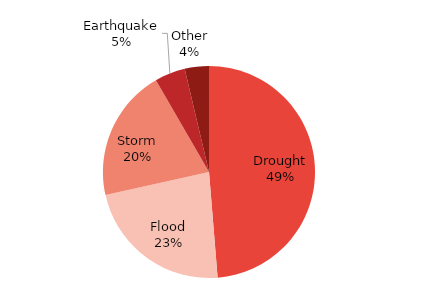
| Category | Series 0 |
|---|---|
| Drought | 12865600 |
| Flood | 6023457 |
| Storm | 5322806 |
| Earthquake | 1230217 |
| Other | 974605 |